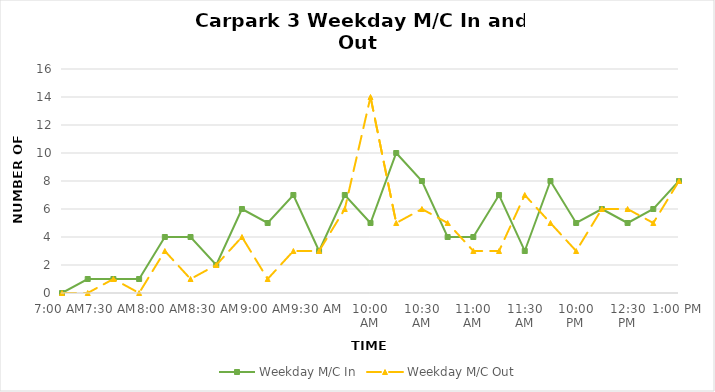
| Category | Weekday M/C In | Weekday M/C Out |
|---|---|---|
| 0.291666666666666 | 0 | 0 |
| 0.302083333333333 | 1 | 0 |
| 0.3125 | 1 | 1 |
| 0.322916666666667 | 1 | 0 |
| 0.333333333333333 | 4 | 3 |
| 0.34375 | 4 | 1 |
| 0.354166666666667 | 2 | 2 |
| 0.364583333333333 | 6 | 4 |
| 0.375 | 5 | 1 |
| 0.385416666666667 | 7 | 3 |
| 0.395833333333333 | 3 | 3 |
| 0.40625 | 7 | 6 |
| 0.416666666666667 | 5 | 14 |
| 0.427083333333333 | 10 | 5 |
| 0.4375 | 8 | 6 |
| 0.447916666666667 | 4 | 5 |
| 0.458333333333333 | 4 | 3 |
| 0.46875 | 7 | 3 |
| 0.479166666666667 | 3 | 7 |
| 0.489583333333333 | 8 | 5 |
| 0.5 | 5 | 3 |
| 0.510416666666667 | 6 | 6 |
| 0.520833333333333 | 5 | 6 |
| 0.53125 | 6 | 5 |
| 0.541666666666667 | 8 | 8 |